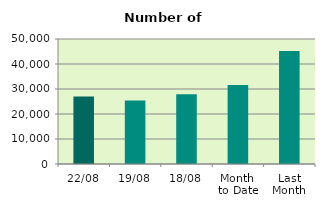
| Category | Series 0 |
|---|---|
| 22/08 | 27008 |
| 19/08 | 25398 |
| 18/08 | 27928 |
| Month 
to Date | 31569.625 |
| Last
Month | 45220.286 |